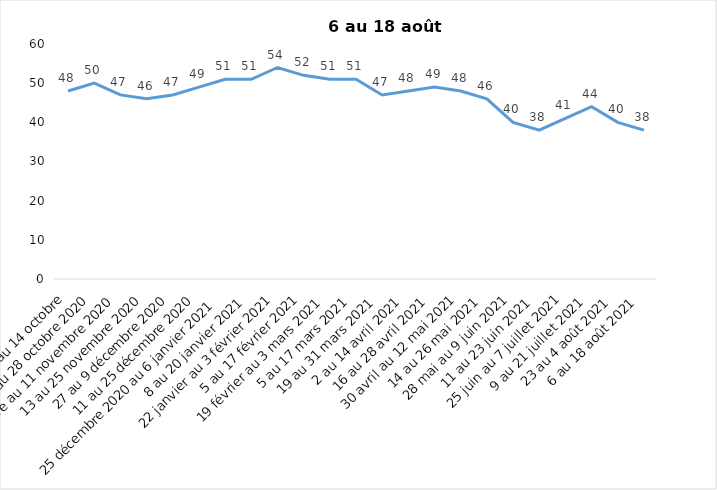
| Category | Toujours aux trois mesures |
|---|---|
| 2 au 14 octobre | 48 |
| 16 au 28 octobre 2020 | 50 |
| 30 octobre au 11 novembre 2020 | 47 |
| 13 au 25 novembre 2020 | 46 |
| 27 au 9 décembre 2020 | 47 |
| 11 au 25 décembre 2020 | 49 |
| 25 décembre 2020 au 6 janvier 2021 | 51 |
| 8 au 20 janvier 2021 | 51 |
| 22 janvier au 3 février 2021 | 54 |
| 5 au 17 février 2021 | 52 |
| 19 février au 3 mars 2021 | 51 |
| 5 au 17 mars 2021 | 51 |
| 19 au 31 mars 2021 | 47 |
| 2 au 14 avril 2021 | 48 |
| 16 au 28 avril 2021 | 49 |
| 30 avril au 12 mai 2021 | 48 |
| 14 au 26 mai 2021 | 46 |
| 28 mai au 9 juin 2021 | 40 |
| 11 au 23 juin 2021 | 38 |
| 25 juin au 7 juillet 2021 | 41 |
| 9 au 21 juillet 2021 | 44 |
| 23 au 4 août 2021 | 40 |
| 6 au 18 août 2021 | 38 |